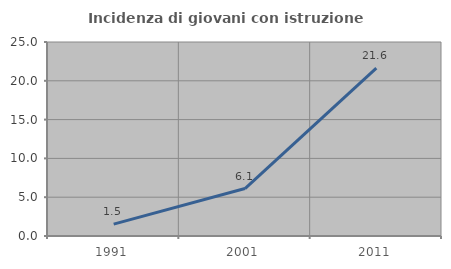
| Category | Incidenza di giovani con istruzione universitaria |
|---|---|
| 1991.0 | 1.527 |
| 2001.0 | 6.114 |
| 2011.0 | 21.622 |